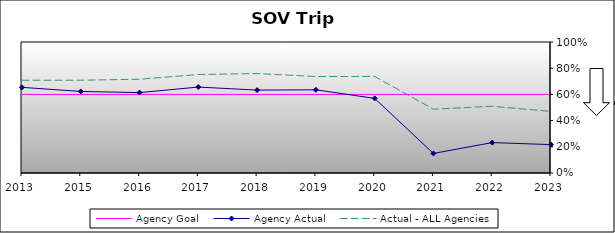
| Category | Agency Goal | Agency Actual | Actual - ALL Agencies |
|---|---|---|---|
| 2013.0 | 0.6 | 0.654 | 0.708 |
| 2015.0 | 0.6 | 0.623 | 0.708 |
| 2016.0 | 0.6 | 0.614 | 0.716 |
| 2017.0 | 0.6 | 0.656 | 0.752 |
| 2018.0 | 0.6 | 0.633 | 0.759 |
| 2019.0 | 0.6 | 0.635 | 0.736 |
| 2020.0 | 0.6 | 0.57 | 0.737 |
| 2021.0 | 0.6 | 0.149 | 0.487 |
| 2022.0 | 0.6 | 0.232 | 0.509 |
| 2023.0 | 0.6 | 0.217 | 0.47 |